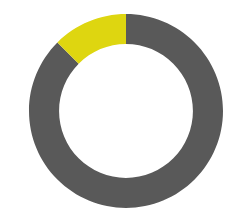
| Category | Series 0 |
|---|---|
| CURRENT QTY | 700 |
| CURRENT - OPTIMAL QTY | -100 |